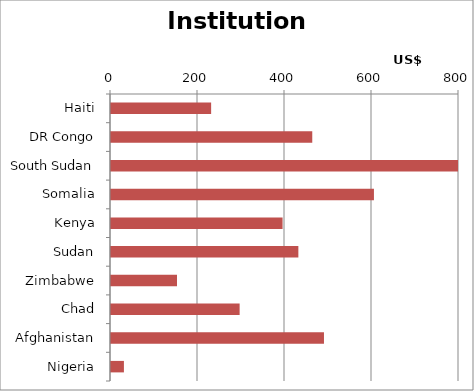
| Category | Institutional |
|---|---|
| Haiti | 230.197 |
| DR Congo | 462.679 |
| South Sudan | 857.446 |
| Somalia | 604.471 |
| Kenya | 394.437 |
| Sudan | 430.72 |
| Zimbabwe | 151.726 |
| Chad | 295.702 |
| Afghanistan | 489.595 |
| Nigeria | 29.692 |